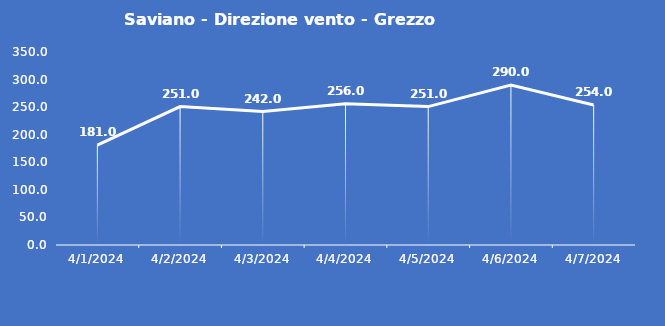
| Category | Saviano - Direzione vento - Grezzo (°N) |
|---|---|
| 4/1/24 | 181 |
| 4/2/24 | 251 |
| 4/3/24 | 242 |
| 4/4/24 | 256 |
| 4/5/24 | 251 |
| 4/6/24 | 290 |
| 4/7/24 | 254 |